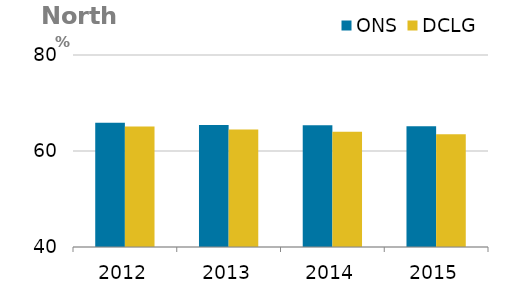
| Category | ONS | DCLG |
|---|---|---|
| 0 | 65.88 | 65.113 |
| 1 | 65.43 | 64.457 |
| 2 | 65.36 | 64.003 |
| 3 | 65.15 | 63.487 |